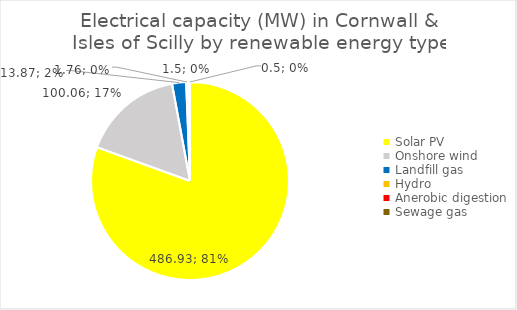
| Category | Series 0 |
|---|---|
| Solar PV | 486.93 |
| Onshore wind | 100.06 |
| Landfill gas | 13.87 |
| Hydro | 1.76 |
| Anerobic digestion | 1.5 |
| Sewage gas | 0.5 |